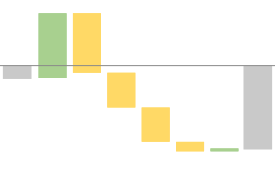
| Category | Series 0 | Series 1 |
|---|---|---|
| 0 | 0 | -28.133 |
| 1 | 0 | 0 |
| 2 | 0 | 0 |
| 3 | 0 | 0 |
| 4 | 0 | 0 |
| 5 | 0 | 0 |
| 6 | 0 | 0 |
| 7 | 0 | -189.254 |